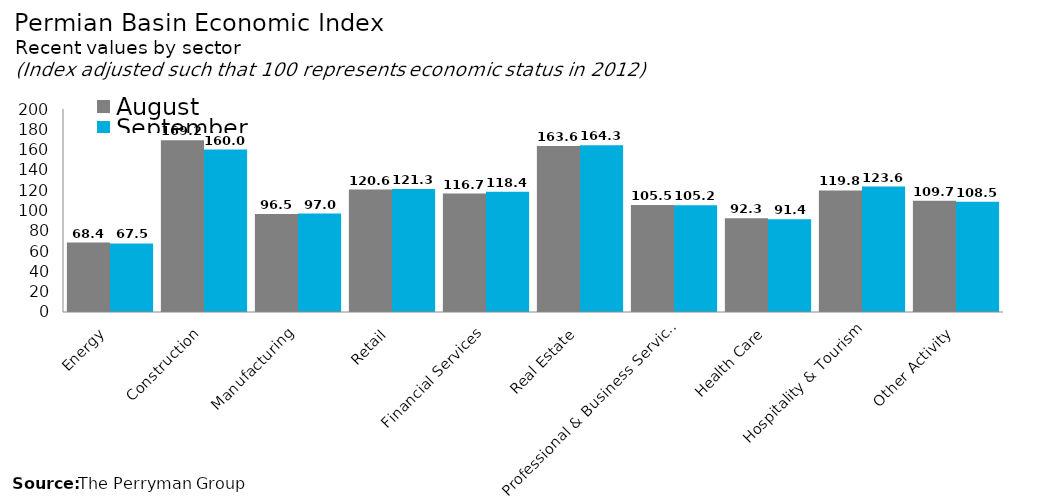
| Category | August | September |
|---|---|---|
| Energy | 68.445 | 67.507 |
| Construction | 169.151 | 160.001 |
| Manufacturing | 96.454 | 97.02 |
| Retail | 120.614 | 121.264 |
| Financial Services | 116.671 | 118.411 |
| Real Estate | 163.597 | 164.315 |
| Professional & Business Services | 105.481 | 105.196 |
| Health Care | 92.348 | 91.422 |
| Hospitality & Tourism | 119.761 | 123.641 |
| Other Activity | 109.682 | 108.511 |